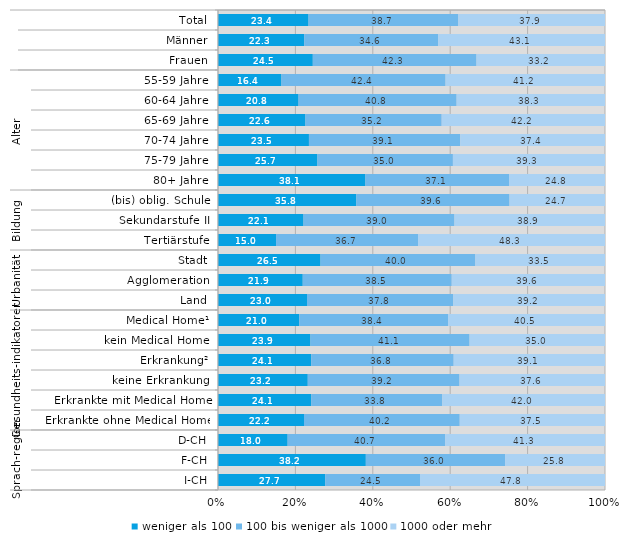
| Category | weniger als 100 | 100 bis weniger als 1000 | 1000 oder mehr |
|---|---|---|---|
| 0 | 23.4 | 38.7 | 37.9 |
| 1 | 22.3 | 34.6 | 43.1 |
| 2 | 24.5 | 42.3 | 33.2 |
| 3 | 16.4 | 42.4 | 41.2 |
| 4 | 20.8 | 40.8 | 38.3 |
| 5 | 22.6 | 35.2 | 42.2 |
| 6 | 23.5 | 39.1 | 37.4 |
| 7 | 25.7 | 35 | 39.3 |
| 8 | 38.1 | 37.1 | 24.8 |
| 9 | 35.8 | 39.6 | 24.7 |
| 10 | 22.1 | 39 | 38.9 |
| 11 | 15 | 36.7 | 48.3 |
| 12 | 26.5 | 40 | 33.5 |
| 13 | 21.9 | 38.5 | 39.6 |
| 14 | 23 | 37.8 | 39.2 |
| 15 | 21 | 38.4 | 40.5 |
| 16 | 23.9 | 41.1 | 35 |
| 17 | 24.1 | 36.8 | 39.1 |
| 18 | 23.2 | 39.2 | 37.6 |
| 19 | 24.1 | 33.8 | 42 |
| 20 | 22.2 | 40.2 | 37.5 |
| 21 | 18 | 40.7 | 41.3 |
| 22 | 38.2 | 36 | 25.8 |
| 23 | 27.7 | 24.5 | 47.8 |